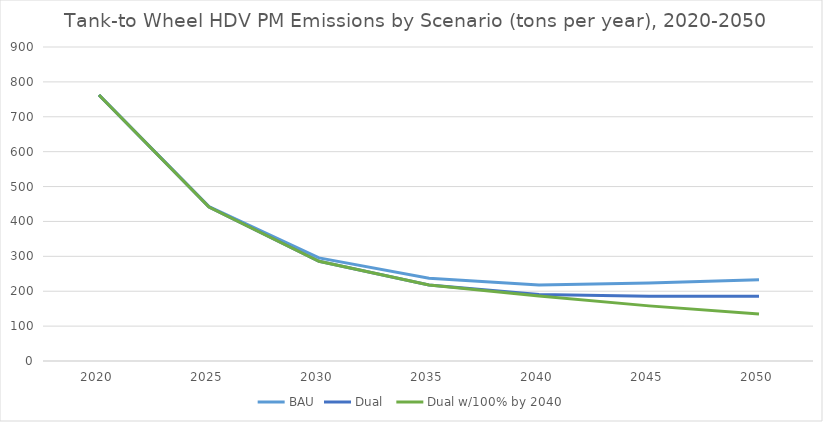
| Category | BAU | Dual  | Dual w/100% by 2040 |
|---|---|---|---|
| 2020.0 | 762.35 | 762.35 | 762.35 |
| 2025.0 | 442.798 | 441.242 | 441.242 |
| 2030.0 | 295.423 | 285.685 | 285.685 |
| 2035.0 | 237.307 | 218.029 | 218.029 |
| 2040.0 | 217.941 | 190.614 | 186.013 |
| 2045.0 | 223.646 | 185.406 | 157.988 |
| 2050.0 | 232.761 | 185.644 | 134.92 |